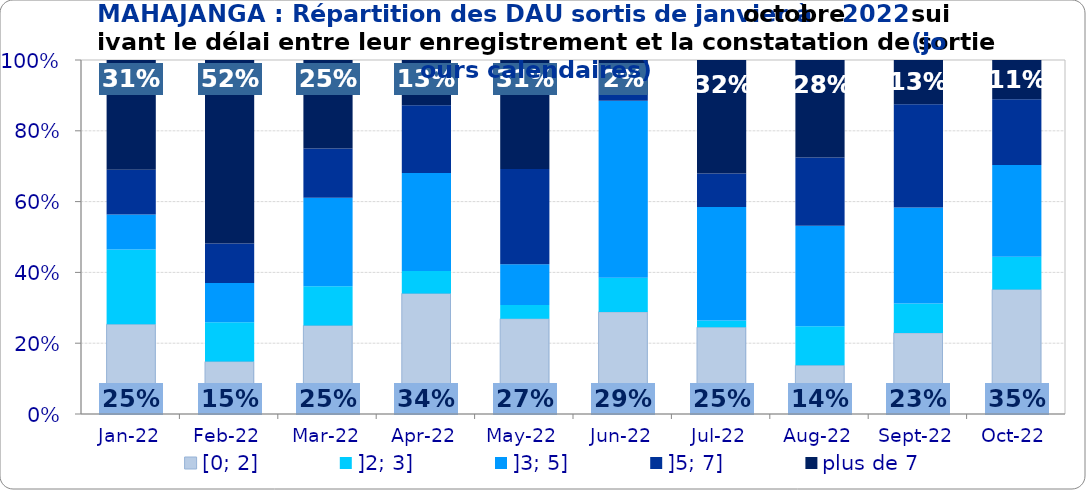
| Category | [0; 2] | ]2; 3] | ]3; 5] | ]5; 7] | plus de 7 |
|---|---|---|---|---|---|
| 2022-01-01 | 0.254 | 0.211 | 0.099 | 0.127 | 0.31 |
| 2022-02-01 | 0.148 | 0.111 | 0.111 | 0.111 | 0.519 |
| 2022-03-01 | 0.25 | 0.111 | 0.25 | 0.139 | 0.25 |
| 2022-04-01 | 0.34 | 0.064 | 0.277 | 0.191 | 0.128 |
| 2022-05-01 | 0.269 | 0.038 | 0.115 | 0.269 | 0.308 |
| 2022-06-01 | 0.288 | 0.096 | 0.5 | 0.096 | 0.019 |
| 2022-07-01 | 0.245 | 0.019 | 0.321 | 0.094 | 0.321 |
| 2022-08-01 | 0.138 | 0.11 | 0.284 | 0.193 | 0.275 |
| 2022-09-01 | 0.229 | 0.083 | 0.271 | 0.292 | 0.125 |
| 2022-10-01 | 0.352 | 0.093 | 0.259 | 0.185 | 0.111 |